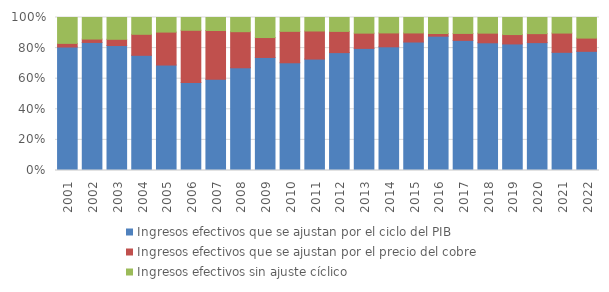
| Category | Ingresos efectivos que se ajustan por el ciclo del PIB | Ingresos efectivos que se ajustan por el precio del cobre | Ingresos efectivos sin ajuste cíclico |
|---|---|---|---|
| 2001.0 | 15978168.282 | 470703.432 | 3347730.712 |
| 2002.0 | 16689800.555 | 439584.469 | 2809545.121 |
| 2003.0 | 17128190.03 | 855146.981 | 2987512.731 |
| 2004.0 | 18983341.824 | 3461779.175 | 2770297.565 |
| 2005.0 | 20702445.526 | 6471053.009 | 2864275.207 |
| 2006.0 | 21241010.771 | 12634043.8 | 3089020.729 |
| 2007.0 | 24285744.742 | 13014282.566 | 3469982.943 |
| 2008.0 | 24766870.366 | 8705001.242 | 3421594.125 |
| 2009.0 | 21698552.081 | 3825741.648 | 3847001.56 |
| 2010.0 | 26538308.707 | 7741141.997 | 3413622.006 |
| 2011.0 | 30627849.836 | 7712958.524 | 3712272.354 |
| 2012.0 | 32832672.145 | 5907623.369 | 3871154.872 |
| 2013.0 | 33537976.719 | 4191898.746 | 4295875.97 |
| 2014.0 | 34486527.012 | 3867745.151 | 4302183.034 |
| 2015.0 | 37679973.481 | 2660472.78 | 4530289.858 |
| 2016.0 | 39825747.656 | 787420.017 | 4748372.514 |
| 2017.0 | 40379796.83 | 2162114.677 | 4939429.491 |
| 2018.0 | 43138925.768 | 3258944.481 | 5284227.722 |
| 2019.0 | 42300747.57 | 3139124.575 | 5701424.292 |
| 2020.0 | 39160425.058 | 2751271.677 | 4941218.322 |
| 2021.0 | 49913136.004 | 8132989.449 | 6575733.949 |
| 2022.0 | 53467833.77 | 5939105.493 | 9242435.613 |